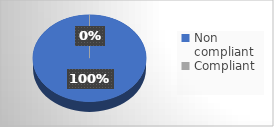
| Category | Series 0 |
|---|---|
| Non compliant | 15 |
| Compliant | 0 |